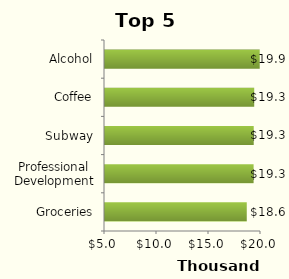
| Category | Total |
|---|---|
| Groceries | 18631.779 |
| Professional Development | 19288.295 |
| Subway | 19300.271 |
| Coffee | 19348.176 |
| Alcohol | 19877.309 |